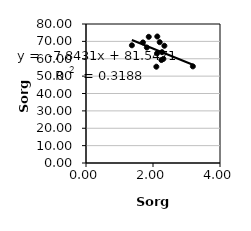
| Category | Series 0 |
|---|---|
| 1.37 | 67.744 |
| 1.7 | 69.396 |
| 2.27 | 63.779 |
| 2.1 | 55.428 |
| 2.12 | 63.077 |
| 2.2512 | 59.256 |
| 1.8732 | 72.616 |
| 2.31 | 59.912 |
| 2.128 | 72.805 |
| 3.19 | 55.614 |
| 2.34 | 67.471 |
| 2.2 | 69.546 |
| 1.8153884429 | 66.469 |